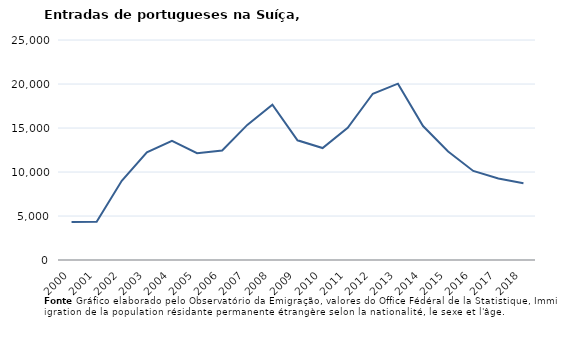
| Category | Entradas |
|---|---|
| 2000.0 | 4311 |
| 2001.0 | 4347 |
| 2002.0 | 9005 |
| 2003.0 | 12228 |
| 2004.0 | 13539 |
| 2005.0 | 12138 |
| 2006.0 | 12441 |
| 2007.0 | 15351 |
| 2008.0 | 17657 |
| 2009.0 | 13601 |
| 2010.0 | 12720 |
| 2011.0 | 15020 |
| 2012.0 | 18892 |
| 2013.0 | 20039 |
| 2014.0 | 15221 |
| 2015.0 | 12325 |
| 2016.0 | 10123 |
| 2017.0 | 9257 |
| 2018.0 | 8733 |